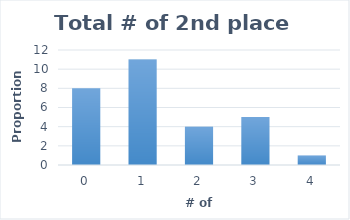
| Category | # |
|---|---|
| 0.0 | 8 |
| 1.0 | 11 |
| 2.0 | 4 |
| 3.0 | 5 |
| 4.0 | 1 |